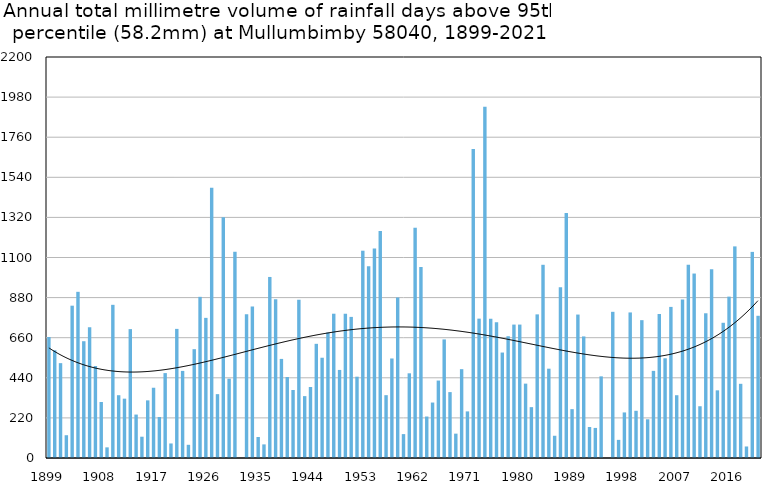
| Category | Annual total mm in days above 95th percentile |
|---|---|
| 1899 | 664 |
| 1900 | 591.2 |
| 1901 | 520.4 |
| 1902 | 125 |
| 1903 | 835.7 |
| 1904 | 911.7 |
| 1905 | 640.7 |
| 1906 | 717.6 |
| 1907 | 504.7 |
| 1908 | 307.3 |
| 1909 | 58.4 |
| 1910 | 840.4 |
| 1911 | 344.5 |
| 1912 | 325.5 |
| 1913 | 707.1 |
| 1914 | 238.3 |
| 1915 | 116.8 |
| 1916 | 316.2 |
| 1917 | 385.5 |
| 1918 | 225.1 |
| 1919 | 465.8 |
| 1920 | 79.8 |
| 1921 | 708.4 |
| 1922 | 477.8 |
| 1923 | 72.4 |
| 1924 | 597.1 |
| 1925 | 884.2 |
| 1926 | 768.8 |
| 1927 | 1482.6 |
| 1928 | 350.3 |
| 1929 | 1321.3 |
| 1930 | 435.1 |
| 1931 | 1131.5 |
| 1932 | 0 |
| 1933 | 789.2 |
| 1934 | 831.6 |
| 1935 | 115.3 |
| 1936 | 74.7 |
| 1937 | 993.3 |
| 1938 | 871.2 |
| 1939 | 543.7 |
| 1940 | 444.3 |
| 1941 | 373.2 |
| 1942 | 868.3 |
| 1943 | 339.5 |
| 1944 | 389.6 |
| 1945 | 626.4 |
| 1946 | 550.1 |
| 1947 | 688.5 |
| 1948 | 791.6 |
| 1949 | 483.1 |
| 1950 | 791.8 |
| 1951 | 774.2 |
| 1952 | 446.1 |
| 1953 | 1137.3 |
| 1954 | 1052.6 |
| 1955 | 1148.8 |
| 1956 | 1245.4 |
| 1957 | 344.7 |
| 1958 | 546 |
| 1959 | 880 |
| 1960 | 131.1 |
| 1961 | 464.6 |
| 1962 | 1263.3 |
| 1963 | 1047.8 |
| 1964 | 227.6 |
| 1965 | 304.3 |
| 1966 | 424.9 |
| 1967 | 650.6 |
| 1968 | 361.5 |
| 1969 | 133.6 |
| 1970 | 487.4 |
| 1971 | 255.7 |
| 1972 | 1695.6 |
| 1973 | 764.6 |
| 1974 | 1927 |
| 1975 | 763.8 |
| 1976 | 745 |
| 1977 | 578.6 |
| 1978 | 668 |
| 1979 | 732 |
| 1980 | 732 |
| 1981 | 408 |
| 1982 | 279 |
| 1983 | 788 |
| 1984 | 1060 |
| 1985 | 490 |
| 1986 | 122 |
| 1987 | 937 |
| 1988 | 1344 |
| 1989 | 268 |
| 1990 | 787 |
| 1991 | 667 |
| 1992 | 170 |
| 1993 | 165 |
| 1994 | 448 |
| 1995 | 0 |
| 1996 | 802 |
| 1997 | 99.5 |
| 1998 | 250 |
| 1999 | 798.6 |
| 2000 | 259 |
| 2001 | 756.2 |
| 2002 | 212.4 |
| 2003 | 478 |
| 2004 | 790 |
| 2005 | 547 |
| 2006 | 829 |
| 2007 | 344.4 |
| 2008 | 869 |
| 2009 | 1059.8 |
| 2010 | 1012 |
| 2011 | 284 |
| 2012 | 794 |
| 2013 | 1036 |
| 2014 | 371.2 |
| 2015 | 741.8 |
| 2016 | 885.4 |
| 2017 | 1161 |
| 2018 | 407 |
| 2019 | 63.2 |
| 2020 | 1130.8 |
| 2021 | 780.2 |